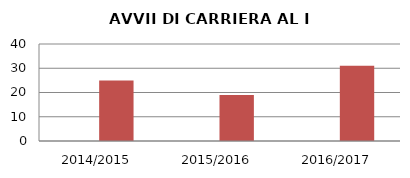
| Category | ANNO | NUMERO |
|---|---|---|
| 2014/2015 | 0 | 25 |
| 2015/2016 | 0 | 19 |
| 2016/2017 | 0 | 31 |